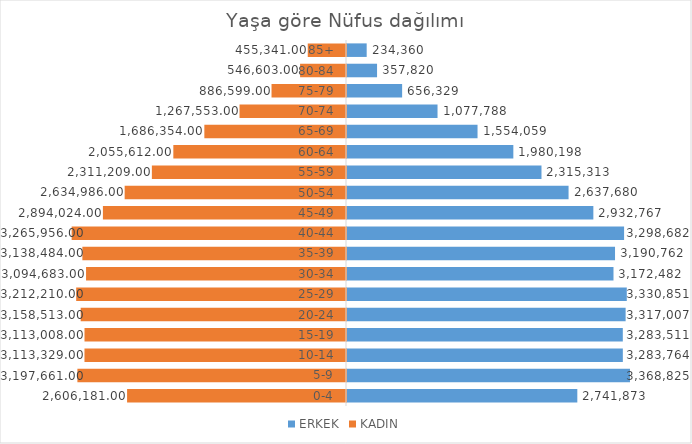
| Category | ERKEK | KADIN |
|---|---|---|
| 0-4 | 2741873 | -2606181 |
| 5-9 | 3368825 | -3197661 |
| 10-14 | 3283764 | -3113329 |
| 15-19 | 3283511 | -3113008 |
| 20-24 | 3317007 | -3158513 |
| 25-29 | 3330851 | -3212210 |
| 30-34 | 3172482 | -3094683 |
| 35-39 | 3190762 | -3138484 |
| 40-44 | 3298682 | -3265956 |
| 45-49 | 2932767 | -2894024 |
| 50-54 | 2637680 | -2634986 |
| 55-59 | 2315313 | -2311209 |
| 60-64 | 1980198 | -2055612 |
| 65-69 | 1554059 | -1686354 |
| 70-74 | 1077788 | -1267553 |
| 75-79 | 656329 | -886599 |
| 80-84 | 357820 | -546603 |
| 85+ | 234360 | -455341 |